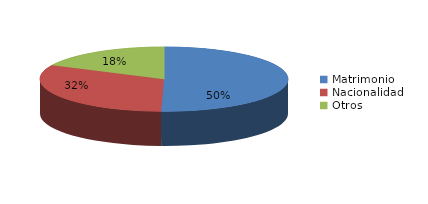
| Category | Series 0 |
|---|---|
| Matrimonio | 486 |
| Nacionalidad | 307 |
| Otros | 172 |